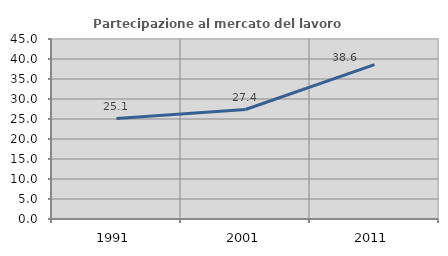
| Category | Partecipazione al mercato del lavoro  femminile |
|---|---|
| 1991.0 | 25.111 |
| 2001.0 | 27.367 |
| 2011.0 | 38.582 |